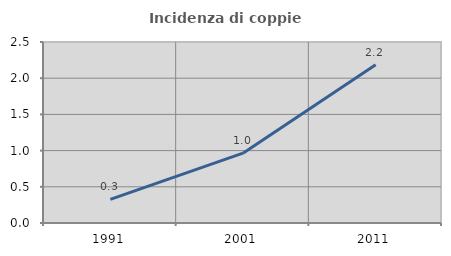
| Category | Incidenza di coppie miste |
|---|---|
| 1991.0 | 0.327 |
| 2001.0 | 0.965 |
| 2011.0 | 2.185 |